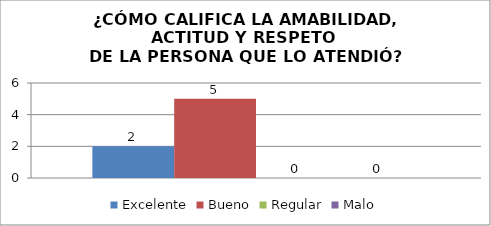
| Category | Excelente | Bueno | Regular | Malo |
|---|---|---|---|---|
| 0 | 2 | 5 | 0 | 0 |